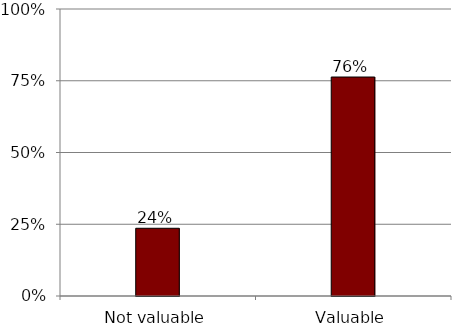
| Category | Series 0 |
|---|---|
| Not valuable | 0.236 |
| Valuable | 0.763 |